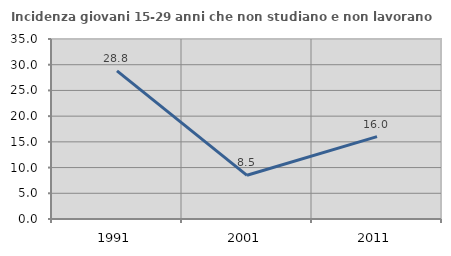
| Category | Incidenza giovani 15-29 anni che non studiano e non lavorano  |
|---|---|
| 1991.0 | 28.814 |
| 2001.0 | 8.497 |
| 2011.0 | 16.007 |